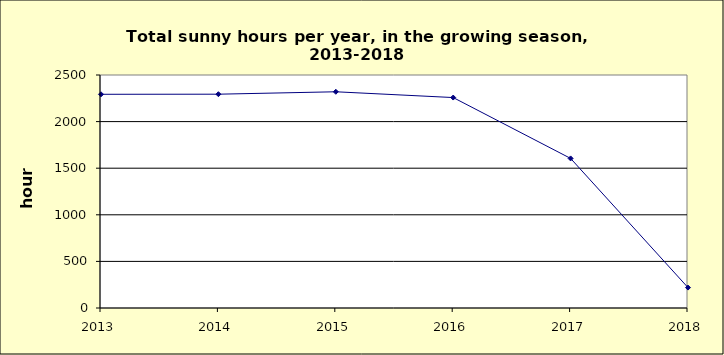
| Category | Series 0 |
|---|---|
| 2013.0 | 2293 |
| 2014.0 | 2294 |
| 2015.0 | 2320 |
| 2016.0 | 2258 |
| 2017.0 | 1605 |
| 2018.0 | 219 |